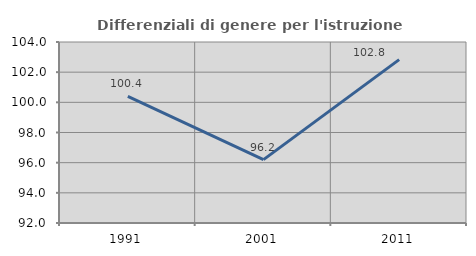
| Category | Differenziali di genere per l'istruzione superiore |
|---|---|
| 1991.0 | 100.393 |
| 2001.0 | 96.204 |
| 2011.0 | 102.833 |